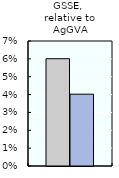
| Category | 2000-02 | 2016-18 |
|---|---|---|
| GSSE, 
relative to AgGVA | 0.06 | 0.04 |